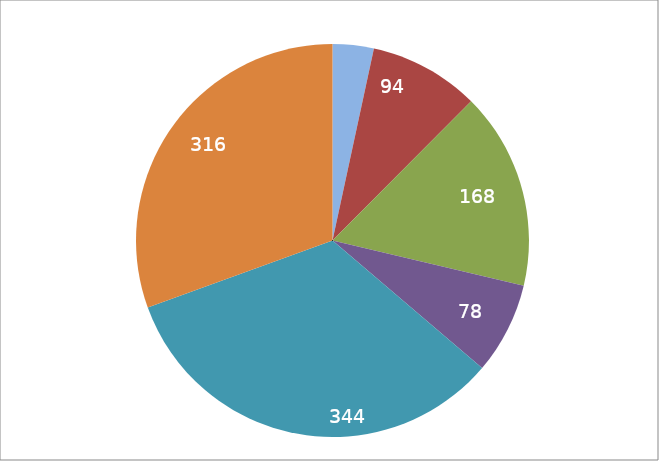
| Category | Series 1 |
|---|---|
| 0 | 35 |
| 1 | 94 |
| 2 | 168 |
| 3 | 78 |
| 4 | 344 |
| 5 | 316 |